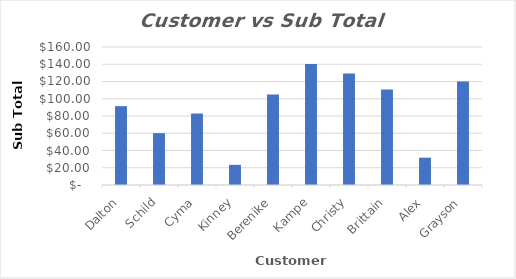
| Category | Sub Total |
|---|---|
| Dalton | 91.43 |
| Schild | 60.12 |
| Cyma | 82.88 |
| Kinney | 23.36 |
| Berenike | 104.95 |
| Kampe | 140.4 |
| Christy | 129.4 |
| Brittain | 110.76 |
| Alex | 31.68 |
| Grayson | 119.88 |